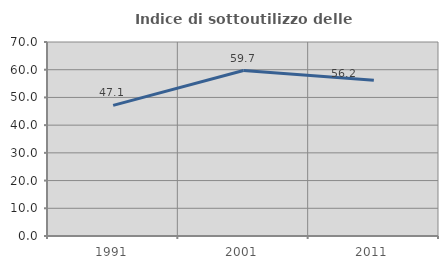
| Category | Indice di sottoutilizzo delle abitazioni  |
|---|---|
| 1991.0 | 47.12 |
| 2001.0 | 59.694 |
| 2011.0 | 56.201 |